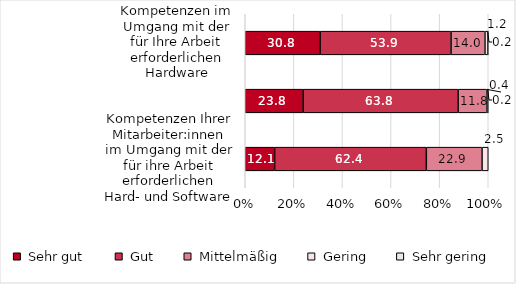
| Category | Series 0 | Series 1 | Series 2 | Series 3 | Series 4 |
|---|---|---|---|---|---|
| Kompetenzen im Umgang mit der für Ihre Arbeit erforderlichen Hardware | 30.814 | 53.876 | 13.953 | 1.163 | 0.194 |
| Kompetenzen im Umgang mit der für Ihre Arbeit erforderlichen Software | 23.819 | 63.78 | 11.811 | 0.394 | 0.197 |
| Kompetenzen Ihrer Mitarbeiter:innen im Umgang mit der für ihre Arbeit erforderlichen Hard- und Software | 12.102 | 62.42 | 22.93 | 2.548 | 0 |